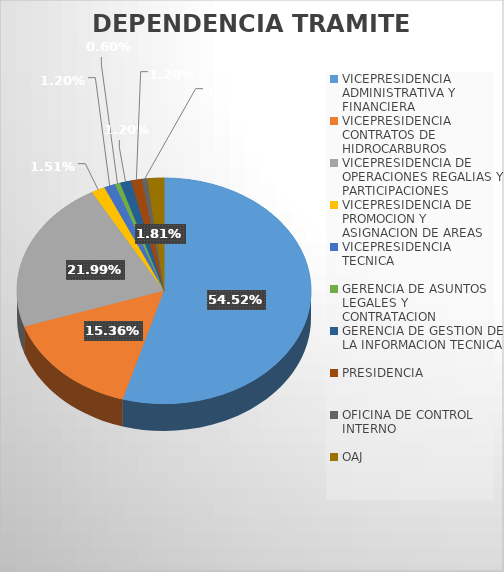
| Category | CANTIDAD |
|---|---|
| VICEPRESIDENCIA ADMINISTRATIVA Y FINANCIERA | 181 |
| VICEPRESIDENCIA CONTRATOS DE HIDROCARBUROS | 51 |
| VICEPRESIDENCIA DE OPERACIONES REGALIAS Y PARTICIPACIONES | 73 |
| VICEPRESIDENCIA DE PROMOCION Y ASIGNACION DE AREAS | 5 |
| VICEPRESIDENCIA TECNICA | 4 |
| GERENCIA DE ASUNTOS LEGALES Y CONTRATACION | 2 |
| GERENCIA DE GESTION DE LA INFORMACION TECNICA | 4 |
| PRESIDENCIA  | 4 |
| OFICINA DE CONTROL INTERNO | 2 |
| OAJ | 6 |